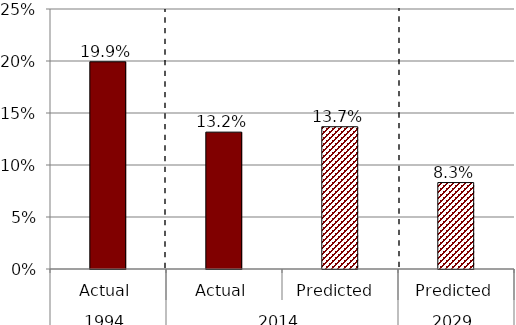
| Category | Series 0 |
|---|---|
| 0 | 0.199 |
| 1 | 0.132 |
| 2 | 0.137 |
| 3 | 0.083 |